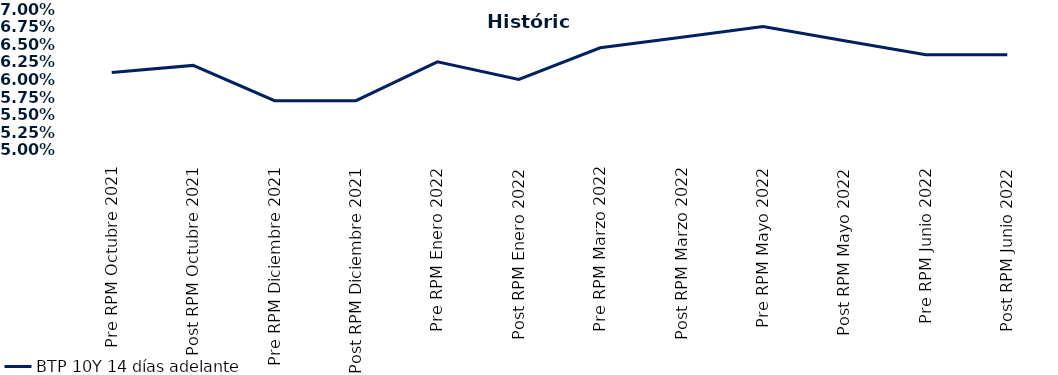
| Category | BTP 10Y 14 días adelante |
|---|---|
| Pre RPM Octubre 2021 | 0.061 |
| Post RPM Octubre 2021 | 0.062 |
| Pre RPM Diciembre 2021 | 0.057 |
| Post RPM Diciembre 2021 | 0.057 |
| Pre RPM Enero 2022 | 0.062 |
| Post RPM Enero 2022 | 0.06 |
| Pre RPM Marzo 2022 | 0.064 |
| Post RPM Marzo 2022 | 0.066 |
| Pre RPM Mayo 2022 | 0.068 |
| Post RPM Mayo 2022 | 0.066 |
| Pre RPM Junio 2022 | 0.064 |
| Post RPM Junio 2022 | 0.064 |